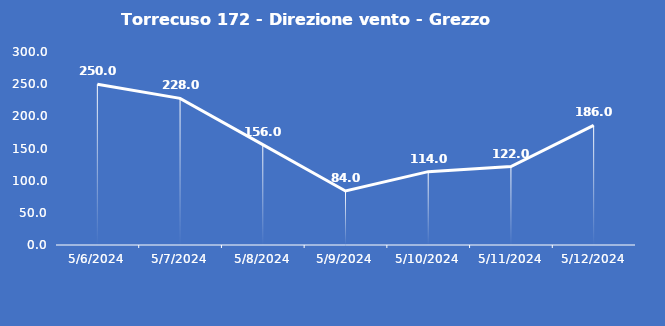
| Category | Torrecuso 172 - Direzione vento - Grezzo (°N) |
|---|---|
| 5/6/24 | 250 |
| 5/7/24 | 228 |
| 5/8/24 | 156 |
| 5/9/24 | 84 |
| 5/10/24 | 114 |
| 5/11/24 | 122 |
| 5/12/24 | 186 |